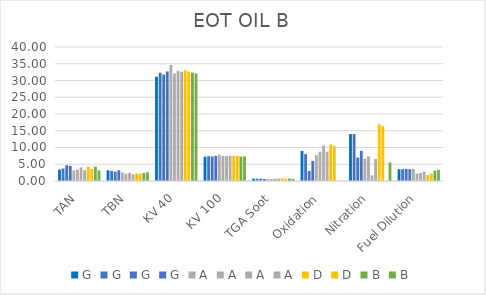
| Category | G | A | D | B |
|---|---|---|---|---|
| TAN | 4.52 | 3.22 | 3.6 | 3.15 |
| TBN | 3.2 | 2 | 2.2 | 2.6 |
| KV 40 | 32.71 | 32.603 | 32.69 | 32.08 |
| KV 100 | 7.53 | 7.52 | 7.51 | 7.35 |
| TGA Soot | 0.6 | 0.7 | 0.7 | 0.58 |
| Oxidation | 6 | 8.75 | 10.39 | 0 |
| Nitration | 9 | 6.61 | 16.43 | 5.5 |
| Fuel Dilution | 3.5 | 2.8 | 2.2 | 3.3 |